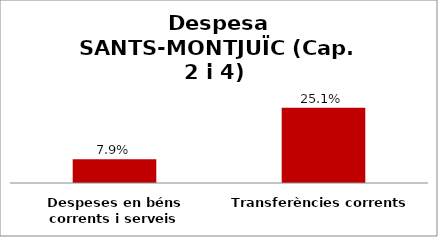
| Category | Series 0 |
|---|---|
| Despeses en béns corrents i serveis | 0.079 |
| Transferències corrents | 0.251 |